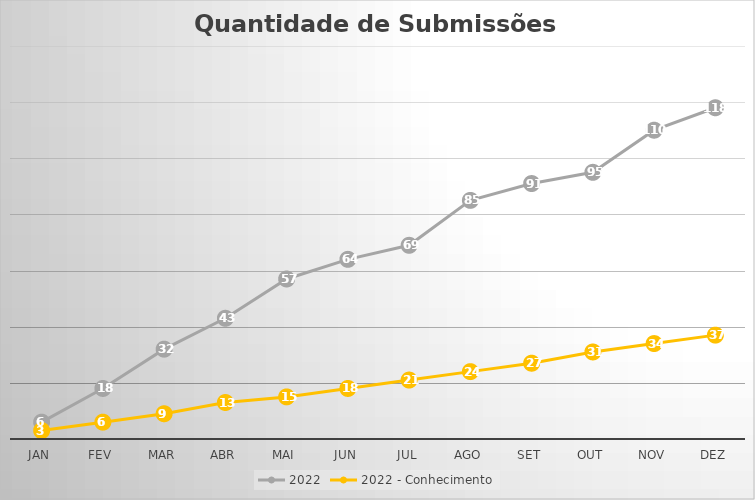
| Category | 2022 | 2022 - Conhecimento |
|---|---|---|
| Jan | 6 | 3 |
| Fev | 18 | 6 |
| Mar | 32 | 9 |
| Abr | 43 | 13 |
| Mai | 57 | 15 |
| Jun | 64 | 18 |
| Jul | 69 | 21 |
| Ago | 85 | 24 |
| Set | 91 | 27 |
| Out | 95 | 31 |
| Nov | 110 | 34 |
| Dez | 118 | 37 |